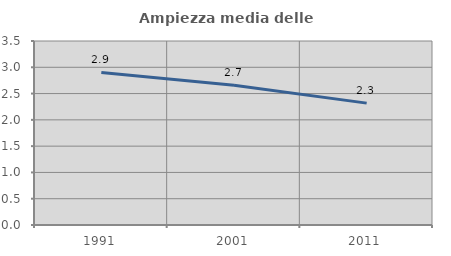
| Category | Ampiezza media delle famiglie |
|---|---|
| 1991.0 | 2.902 |
| 2001.0 | 2.658 |
| 2011.0 | 2.318 |